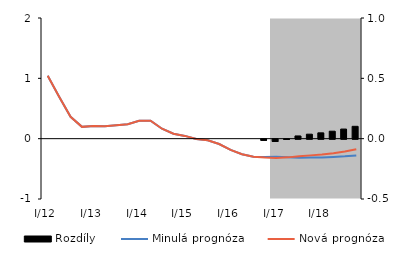
| Category | Rozdíly |
|---|---|
| 0 | 0 |
| 1 | 0 |
| 2 | 0 |
| 3 | 0 |
| 4 | 0 |
| 5 | 0 |
| 6 | 0 |
| 7 | 0 |
| 8 | 0 |
| 9 | 0 |
| 10 | 0 |
| 11 | 0 |
| 12 | 0 |
| 13 | 0 |
| 14 | 0 |
| 15 | 0 |
| 16 | 0 |
| 17 | 0 |
| 18 | 0 |
| 19 | -0.01 |
| 20 | -0.019 |
| 21 | -0.002 |
| 22 | 0.023 |
| 23 | 0.037 |
| 24 | 0.048 |
| 25 | 0.062 |
| 26 | 0.08 |
| 27 | 0.102 |